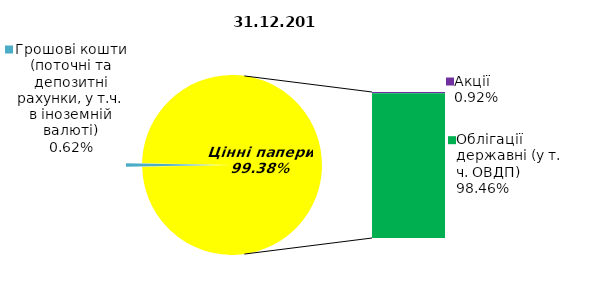
| Category | Series 0 |
|---|---|
| Грошові кошти (поточні та депозитні рахунки, у т.ч. в іноземній валюті) | 0.769 |
| Банківські метали | 0 |
| Нерухомість | 0 |
| Інші активи | 0 |
| Акції | 1.133 |
| Облігації підприємств | 0 |
| Муніципальні облігації | 0 |
| Облігації державні (у т. ч. ОВДП) | 121.663 |
| Іпотечні сертифікати | 0 |